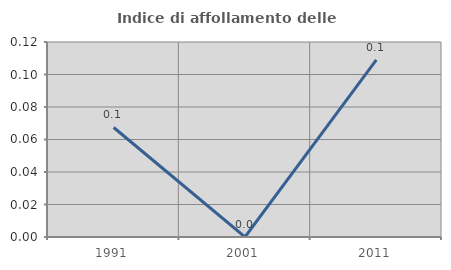
| Category | Indice di affollamento delle abitazioni  |
|---|---|
| 1991.0 | 0.067 |
| 2001.0 | 0 |
| 2011.0 | 0.109 |